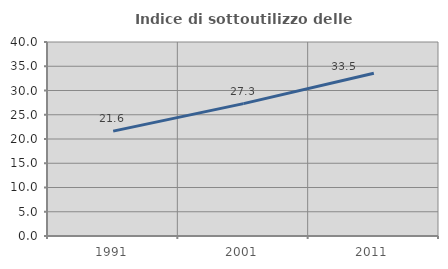
| Category | Indice di sottoutilizzo delle abitazioni  |
|---|---|
| 1991.0 | 21.625 |
| 2001.0 | 27.294 |
| 2011.0 | 33.547 |